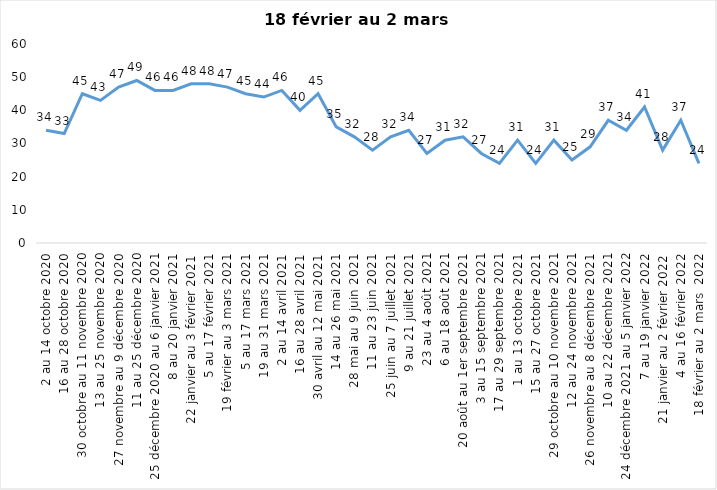
| Category | Toujours aux trois mesures |
|---|---|
| 2 au 14 octobre 2020 | 34 |
| 16 au 28 octobre 2020 | 33 |
| 30 octobre au 11 novembre 2020 | 45 |
| 13 au 25 novembre 2020 | 43 |
| 27 novembre au 9 décembre 2020 | 47 |
| 11 au 25 décembre 2020 | 49 |
| 25 décembre 2020 au 6 janvier 2021 | 46 |
| 8 au 20 janvier 2021 | 46 |
| 22 janvier au 3 février 2021 | 48 |
| 5 au 17 février 2021 | 48 |
| 19 février au 3 mars 2021 | 47 |
| 5 au 17 mars 2021 | 45 |
| 19 au 31 mars 2021 | 44 |
| 2 au 14 avril 2021 | 46 |
| 16 au 28 avril 2021 | 40 |
| 30 avril au 12 mai 2021 | 45 |
| 14 au 26 mai 2021 | 35 |
| 28 mai au 9 juin 2021 | 32 |
| 11 au 23 juin 2021 | 28 |
| 25 juin au 7 juillet 2021 | 32 |
| 9 au 21 juillet 2021 | 34 |
| 23 au 4 août 2021 | 27 |
| 6 au 18 août 2021 | 31 |
| 20 août au 1er septembre 2021 | 32 |
| 3 au 15 septembre 2021 | 27 |
| 17 au 29 septembre 2021 | 24 |
| 1 au 13 octobre 2021 | 31 |
| 15 au 27 octobre 2021 | 24 |
| 29 octobre au 10 novembre 2021 | 31 |
| 12 au 24 novembre 2021 | 25 |
| 26 novembre au 8 décembre 2021 | 29 |
| 10 au 22 décembre 2021 | 37 |
| 24 décembre 2021 au 5 janvier 2022 | 34 |
| 7 au 19 janvier 2022 | 41 |
| 21 janvier au 2 février 2022 | 28 |
| 4 au 16 février 2022 | 37 |
| 18 février au 2 mars  2022 | 24 |